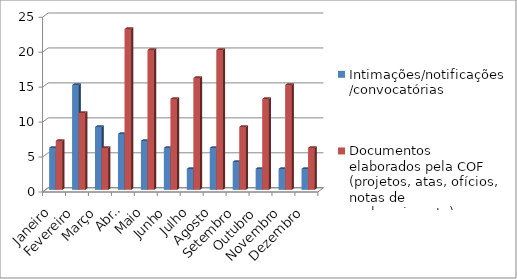
| Category | Intimações/notificações/convocatórias | Documentos elaborados pela COF (projetos, atas, ofícios, notas de esclarecimento) |
|---|---|---|
| Janeiro | 6 | 7 |
| Fevereiro | 15 | 11 |
| Março | 9 | 6 |
| Abril | 8 | 23 |
| Maio | 7 | 20 |
| Junho | 6 | 13 |
| Julho | 3 | 16 |
| Agosto | 6 | 20 |
| Setembro | 4 | 9 |
| Outubro | 3 | 13 |
| Novembro | 3 | 15 |
| Dezembro | 3 | 6 |